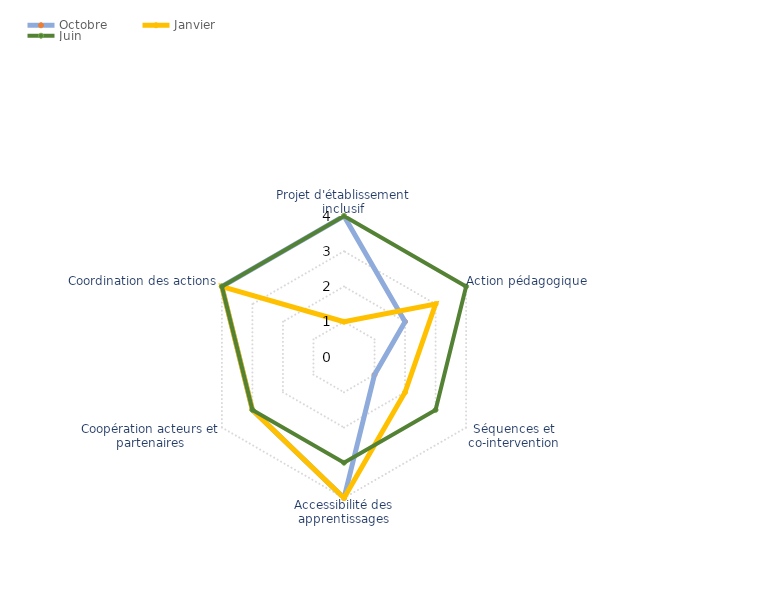
| Category | Octobre | Janvier | Juin |
|---|---|---|---|
| 0 | 4 | 1 | 4 |
| 1 | 2 | 3 | 4 |
| 2 | 1 | 2 | 3 |
| 3 | 4 | 4 | 3 |
| 4 | 3 | 3 | 3 |
| 5 | 4 | 4 | 4 |